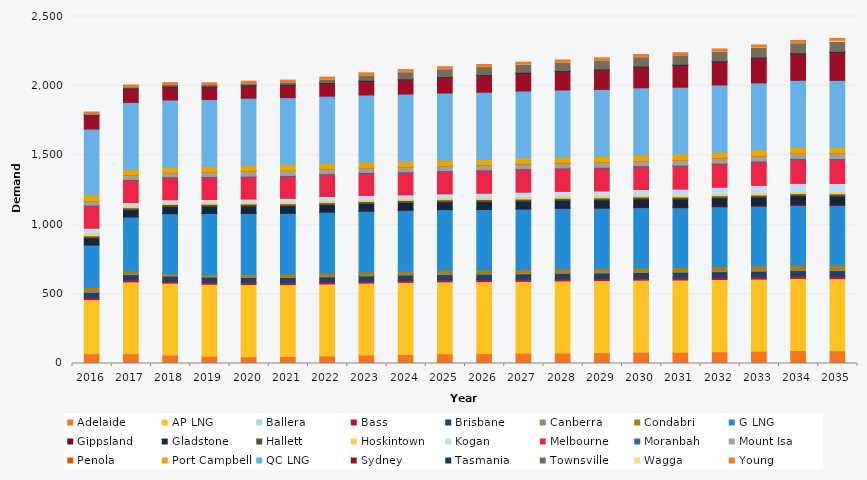
| Category | Adelaide | AP LNG | Ballera | Bass | Brisbane | Canberra | Condabri | G LNG | Gippsland | Gladstone | Hallett | Hoskintown | Kogan | Melbourne | Moranbah | Mount Isa | Penola | Port Campbell | QC LNG | Sydney | Tasmania | Townsville | Wagga | Young |
|---|---|---|---|---|---|---|---|---|---|---|---|---|---|---|---|---|---|---|---|---|---|---|---|---|
| 2016.0 | 71.128 | 388.69 | 0.036 | 15.578 | 36.933 | 8.598 | 28.035 | 305.178 | 0.615 | 50.691 | 13.941 | 19.478 | 35.172 | 160.378 | 6.45 | 29.764 | 2.67 | 42.032 | 474.034 | 96.363 | 7.069 | 6.694 | 0.264 | 12.098 |
| 2017.0 | 70.052 | 517.774 | 0.088 | 15.681 | 36.877 | 8.674 | 18.12 | 389.235 | 0.653 | 50.742 | 14.095 | 14.291 | 23.224 | 160.721 | 6.443 | 29.052 | 2.69 | 40.096 | 482.502 | 97.568 | 7.179 | 8.383 | 0.291 | 12.197 |
| 2018.0 | 60.738 | 517.774 | 0.192 | 14.18 | 36.972 | 8.682 | 9.488 | 431.486 | 0.745 | 50.889 | 14.281 | 14.006 | 20.159 | 159.018 | 6.444 | 29.368 | 2.746 | 39.168 | 482.502 | 93.028 | 7.205 | 11.841 | 0.376 | 12.236 |
| 2019.0 | 52.818 | 517.774 | 0.2 | 14.241 | 37.081 | 8.65 | 9.599 | 440.174 | 0.714 | 51.843 | 14.148 | 13.898 | 20.382 | 158.797 | 6.455 | 29.61 | 2.589 | 40.399 | 482.502 | 89.158 | 7.293 | 11.909 | 0.305 | 12.226 |
| 2020.0 | 49.46 | 519.159 | 0.29 | 14.299 | 37.184 | 8.576 | 11.919 | 441.353 | 0.717 | 52.126 | 14.099 | 13.864 | 21.552 | 158.648 | 6.642 | 35.478 | 2.559 | 39.668 | 483.793 | 89.038 | 7.375 | 13.513 | 0.362 | 12.185 |
| 2021.0 | 49.825 | 517.792 | 0.597 | 14.325 | 37.27 | 8.48 | 16.32 | 438.63 | 0.762 | 52.366 | 14.101 | 13.593 | 25.641 | 158.374 | 6.823 | 35.424 | 2.571 | 40.543 | 482.474 | 89.114 | 7.453 | 16.818 | 0.494 | 12.121 |
| 2022.0 | 54.043 | 517.822 | 0.805 | 14.34 | 37.486 | 8.449 | 19.362 | 438.63 | 0.875 | 52.736 | 14.142 | 14.474 | 29.943 | 157.653 | 7.011 | 32.911 | 2.592 | 40.113 | 482.43 | 91.451 | 7.526 | 24.482 | 1.191 | 12.121 |
| 2023.0 | 60.594 | 517.851 | 0.643 | 14.376 | 37.799 | 8.493 | 19.937 | 438.279 | 1.382 | 53.121 | 14.336 | 14.094 | 30.142 | 158.342 | 7.046 | 33.176 | 2.677 | 40.01 | 482.386 | 98.095 | 7.595 | 38.825 | 2.933 | 12.183 |
| 2024.0 | 64.68 | 519.267 | 0.446 | 14.485 | 38.191 | 8.587 | 19.563 | 439.452 | 1.619 | 53.506 | 14.405 | 13.997 | 26.513 | 159.604 | 7.084 | 32.959 | 2.688 | 40.738 | 483.633 | 101.483 | 7.66 | 51.2 | 3.107 | 12.289 |
| 2025.0 | 69.76 | 517.911 | 0.503 | 14.589 | 38.594 | 8.685 | 20.959 | 437.571 | 2.187 | 53.913 | 14.379 | 14.057 | 28.645 | 161.087 | 7.122 | 33.262 | 2.618 | 40.475 | 482.298 | 110.482 | 7.721 | 56.461 | 2.984 | 12.4 |
| 2026.0 | 71.217 | 517.94 | 0.583 | 14.685 | 38.985 | 8.783 | 22.082 | 435.47 | 2.273 | 54.339 | 14.377 | 14.604 | 31.021 | 161.527 | 7.159 | 33.546 | 2.654 | 40.684 | 482.255 | 119.892 | 7.779 | 57.248 | 2.234 | 12.511 |
| 2027.0 | 73.04 | 517.97 | 0.702 | 14.781 | 39.392 | 8.878 | 22.715 | 435.47 | 2.522 | 54.775 | 14.396 | 15.545 | 33.801 | 162.088 | 7.199 | 33.856 | 2.647 | 41.381 | 482.211 | 126.672 | 7.833 | 58.082 | 2.04 | 12.618 |
| 2028.0 | 74.89 | 519.385 | 0.679 | 14.875 | 39.803 | 8.968 | 22.259 | 436.636 | 3.569 | 55.201 | 14.332 | 15.549 | 33.624 | 162.36 | 7.24 | 34.163 | 2.565 | 41.191 | 483.457 | 132.33 | 7.883 | 61.34 | 1.971 | 12.72 |
| 2029.0 | 77.919 | 518.029 | 0.713 | 14.964 | 40.226 | 9.058 | 22.448 | 435.47 | 4.551 | 55.645 | 14.361 | 15.296 | 34.308 | 163.564 | 7.282 | 34.465 | 2.559 | 41.492 | 482.123 | 139.753 | 7.929 | 65.041 | 2.373 | 12.822 |
| 2030.0 | 81.218 | 518.058 | 0.843 | 15.061 | 40.665 | 9.155 | 23.556 | 434.501 | 6.614 | 56.099 | 14.416 | 14.85 | 38.236 | 164.866 | 7.327 | 34.782 | 2.543 | 41.401 | 482.079 | 148.855 | 7.973 | 67.043 | 2.581 | 12.931 |
| 2031.0 | 81.894 | 518.088 | 0.963 | 15.17 | 41.11 | 9.258 | 24.339 | 431.623 | 6.28 | 56.596 | 14.406 | 14.658 | 41.659 | 165.432 | 7.373 | 35.102 | 2.528 | 42.04 | 482.035 | 157.045 | 8.02 | 68.029 | 2.427 | 13.044 |
| 2032.0 | 84.365 | 519.504 | 1.098 | 15.288 | 41.569 | 9.37 | 25.528 | 432.778 | 6.963 | 57.09 | 14.454 | 14.843 | 46.409 | 166.729 | 7.422 | 35.437 | 2.542 | 41.906 | 483.281 | 166.288 | 8.066 | 69.501 | 2.493 | 13.165 |
| 2033.0 | 88.55 | 518.147 | 1.27 | 15.405 | 42.043 | 9.486 | 26.94 | 431.623 | 8.222 | 57.588 | 14.475 | 16.419 | 52.836 | 168.474 | 7.472 | 35.784 | 2.548 | 42.597 | 481.947 | 177.68 | 8.111 | 70.924 | 3.012 | 13.292 |
| 2034.0 | 93.183 | 518.177 | 1.383 | 15.522 | 42.517 | 9.601 | 27.852 | 431.623 | 10.973 | 58.108 | 14.583 | 16.662 | 57.198 | 172.274 | 7.539 | 36.132 | 2.589 | 42.383 | 481.903 | 190.326 | 8.155 | 71.665 | 3.842 | 13.418 |
| 2035.0 | 91.437 | 518.206 | 1.436 | 15.639 | 42.99 | 9.711 | 28.287 | 431.623 | 9.705 | 58.624 | 14.633 | 15.335 | 59.164 | 172.553 | 7.606 | 36.483 | 2.603 | 42.46 | 481.453 | 200.733 | 8.197 | 71.929 | 8.034 | 13.536 |